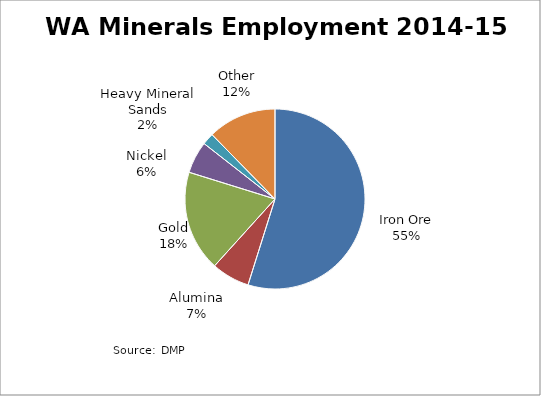
| Category | Series 0 |
|---|---|
| Iron Ore | 58092.5 |
| Alumina | 7258 |
| Gold | 19175.25 |
| Nickel | 6096.25 |
| Heavy Mineral Sands | 2241 |
| Other | 13058.917 |